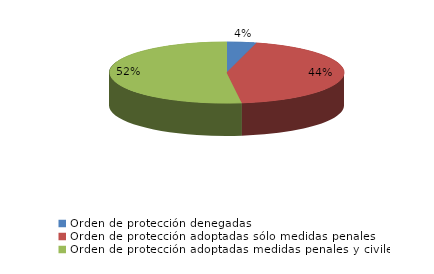
| Category | Series 0 |
|---|---|
| Orden de protección denegadas | 44 |
| Orden de protección adoptadas sólo medidas penales | 472 |
| Orden de protección adoptadas medidas penales y civiles | 560 |